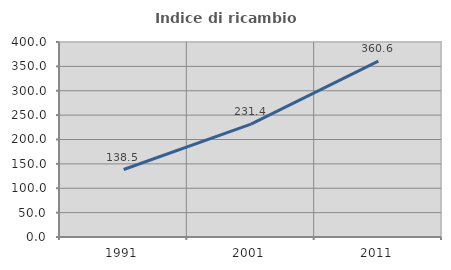
| Category | Indice di ricambio occupazionale  |
|---|---|
| 1991.0 | 138.462 |
| 2001.0 | 231.429 |
| 2011.0 | 360.606 |